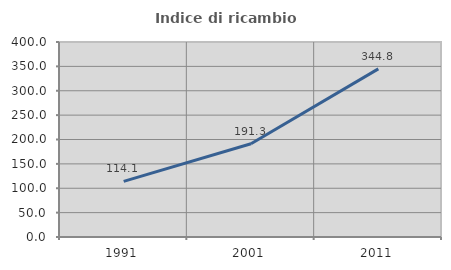
| Category | Indice di ricambio occupazionale  |
|---|---|
| 1991.0 | 114.11 |
| 2001.0 | 191.262 |
| 2011.0 | 344.828 |